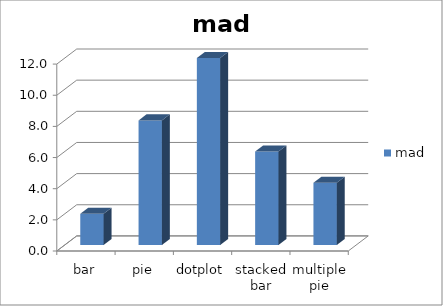
| Category | mad |
|---|---|
| bar | 2 |
| pie | 8 |
| dotplot | 12 |
| stacked bar | 6 |
| multiple pie | 4 |